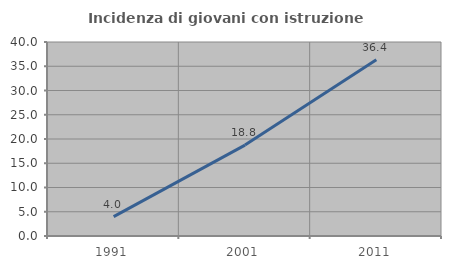
| Category | Incidenza di giovani con istruzione universitaria |
|---|---|
| 1991.0 | 4 |
| 2001.0 | 18.75 |
| 2011.0 | 36.364 |